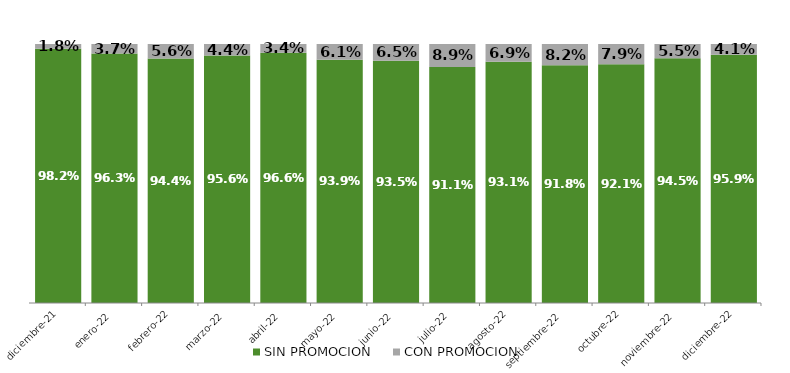
| Category | SIN PROMOCION   | CON PROMOCION   |
|---|---|---|
| 2021-12-01 | 0.982 | 0.018 |
| 2022-01-01 | 0.963 | 0.037 |
| 2022-02-01 | 0.944 | 0.056 |
| 2022-03-01 | 0.956 | 0.044 |
| 2022-04-01 | 0.966 | 0.034 |
| 2022-05-01 | 0.939 | 0.061 |
| 2022-06-01 | 0.935 | 0.065 |
| 2022-07-01 | 0.911 | 0.089 |
| 2022-08-01 | 0.931 | 0.069 |
| 2022-09-01 | 0.918 | 0.082 |
| 2022-10-01 | 0.921 | 0.079 |
| 2022-11-01 | 0.945 | 0.055 |
| 2022-12-01 | 0.959 | 0.041 |